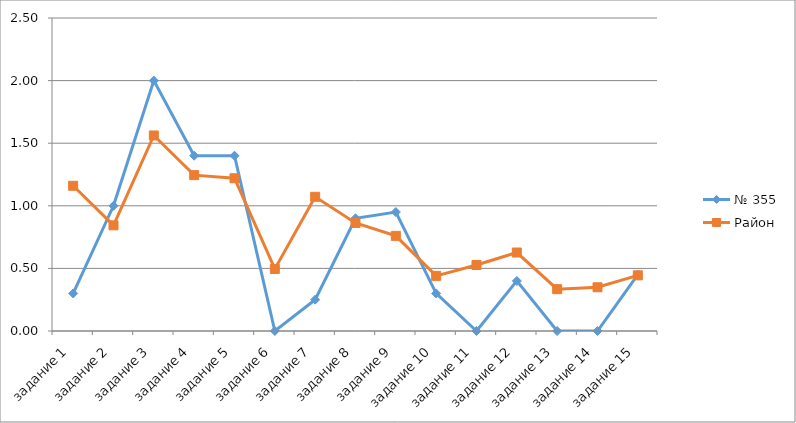
| Category | № 355 | Район |
|---|---|---|
| задание 1 | 0.3 | 1.16 |
| задание 2 | 1 | 0.844 |
| задание 3 | 2 | 1.562 |
| задание 4 | 1.4 | 1.245 |
| задание 5 | 1.4 | 1.22 |
| задание 6 | 0 | 0.496 |
| задание 7 | 0.25 | 1.072 |
| задание 8 | 0.9 | 0.863 |
| задание 9 | 0.95 | 0.76 |
| задание 10 | 0.3 | 0.44 |
| задание 11 | 0 | 0.527 |
| задание 12 | 0.4 | 0.627 |
| задание 13 | 0 | 0.334 |
| задание 14 | 0 | 0.349 |
| задание 15 | 0.45 | 0.445 |